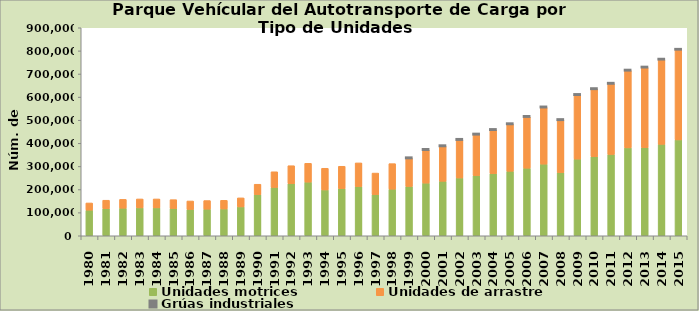
| Category | Unidades motrices | Unidades de arrastre | Grúas industriales |
|---|---|---|---|
| 1980.0 | 110810 | 31120 | 0 |
| 1981.0 | 117090 | 36760 | 0 |
| 1982.0 | 119309 | 38216 | 0 |
| 1983.0 | 120702 | 38639 | 0 |
| 1984.0 | 120702 | 38639 | 0 |
| 1985.0 | 117956 | 38317 | 0 |
| 1986.0 | 114000 | 36500 | 0 |
| 1987.0 | 115092 | 37245 | 0 |
| 1988.0 | 115897 | 37506 | 0 |
| 1989.0 | 124897 | 39113 | 0 |
| 1990.0 | 178130 | 44853 | 0 |
| 1991.0 | 209060 | 67865 | 0 |
| 1992.0 | 224913 | 78233 | 0 |
| 1993.0 | 232203 | 81307 | 0 |
| 1994.0 | 198273 | 93827 | 0 |
| 1995.0 | 204117 | 96638 | 0 |
| 1996.0 | 212909 | 102409 | 0 |
| 1997.0 | 178332 | 92999 | 0 |
| 1998.0 | 201587 | 110530 | 0 |
| 1999.0 | 213292 | 122619 | 126 |
| 2000.0 | 227847 | 144225 | 191 |
| 2001.0 | 235767 | 152341 | 212 |
| 2002.0 | 250025 | 165601 | 221 |
| 2003.0 | 260645 | 177864 | 251 |
| 2004.0 | 268725 | 189568 | 256 |
| 2005.0 | 279112 | 204186 | 266 |
| 2006.0 | 292418 | 222580 | 281 |
| 2007.0 | 310013 | 245843 | 294 |
| 2008.0 | 273455 | 227806 | 277 |
| 2009.0 | 331686 | 278133 | 329 |
| 2010.0 | 342064 | 293053 | 351 |
| 2011.0 | 351705 | 306700 | 355 |
| 2012.0 | 380342 | 334858 | 483 |
| 2013.0 | 381250 | 347112 | 684 |
| 2014.0 | 395552 | 367051 | 877 |
| 2015.0 | 414790 | 390563 | 1052 |